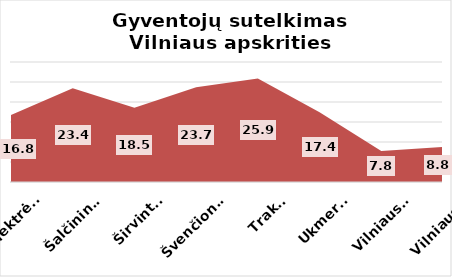
| Category | Series 0 |
|---|---|
| Elektrėnai | 16.75 |
| Šalčininkai | 23.41 |
| Širvintos | 18.54 |
| Švenčionys | 23.68 |
| Trakai | 25.89 |
| Ukmergė | 17.43 |
| Vilniaus r. | 7.78 |
| Vilniaus m. | 8.75 |